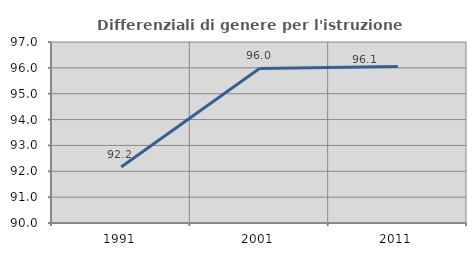
| Category | Differenziali di genere per l'istruzione superiore |
|---|---|
| 1991.0 | 92.168 |
| 2001.0 | 95.977 |
| 2011.0 | 96.055 |